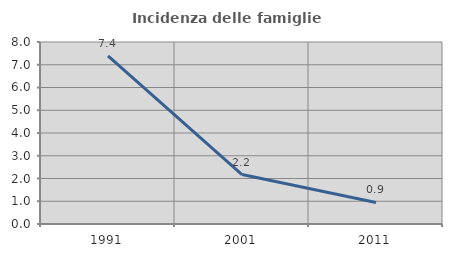
| Category | Incidenza delle famiglie numerose |
|---|---|
| 1991.0 | 7.39 |
| 2001.0 | 2.174 |
| 2011.0 | 0.946 |